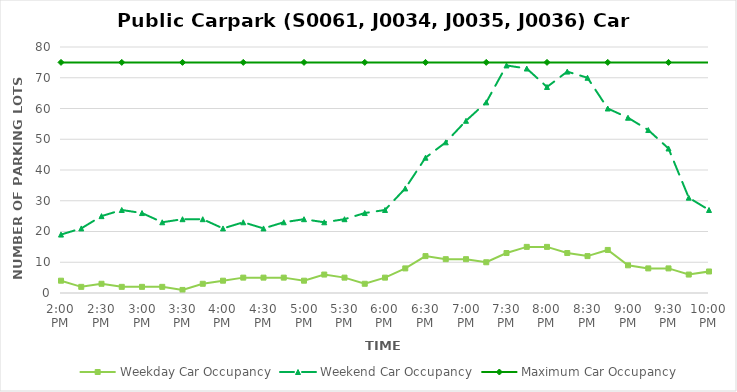
| Category | Weekday Car Occupancy | Weekend Car Occupancy | Maximum Car Occupancy |
|---|---|---|---|
| 0.5833333333333334 | 4 | 19 | 75 |
| 0.59375 | 2 | 21 | 75 |
| 0.604166666666667 | 3 | 25 | 75 |
| 0.614583333333333 | 2 | 27 | 75 |
| 0.625 | 2 | 26 | 75 |
| 0.635416666666666 | 2 | 23 | 75 |
| 0.645833333333333 | 1 | 24 | 75 |
| 0.65625 | 3 | 24 | 75 |
| 0.666666666666666 | 4 | 21 | 75 |
| 0.677083333333333 | 5 | 23 | 75 |
| 0.6875 | 5 | 21 | 75 |
| 0.697916666666666 | 5 | 23 | 75 |
| 0.708333333333333 | 4 | 24 | 75 |
| 0.718749999999999 | 6 | 23 | 75 |
| 0.729166666666666 | 5 | 24 | 75 |
| 0.739583333333333 | 3 | 26 | 75 |
| 0.75 | 5 | 27 | 75 |
| 0.7604166666666666 | 8 | 34 | 75 |
| 0.7708333333333334 | 12 | 44 | 75 |
| 0.78125 | 11 | 49 | 75 |
| 0.7916666666666666 | 11 | 56 | 75 |
| 0.8020833333333334 | 10 | 62 | 75 |
| 0.8125 | 13 | 74 | 75 |
| 0.8229166666666666 | 15 | 73 | 75 |
| 0.8333333333333334 | 15 | 67 | 75 |
| 0.84375 | 13 | 72 | 75 |
| 0.8541666666666666 | 12 | 70 | 75 |
| 0.8645833333333334 | 14 | 60 | 75 |
| 0.875 | 9 | 57 | 75 |
| 0.8854166666666666 | 8 | 53 | 75 |
| 0.8958333333333334 | 8 | 47 | 75 |
| 0.90625 | 6 | 31 | 75 |
| 0.9166666666666666 | 7 | 27 | 75 |